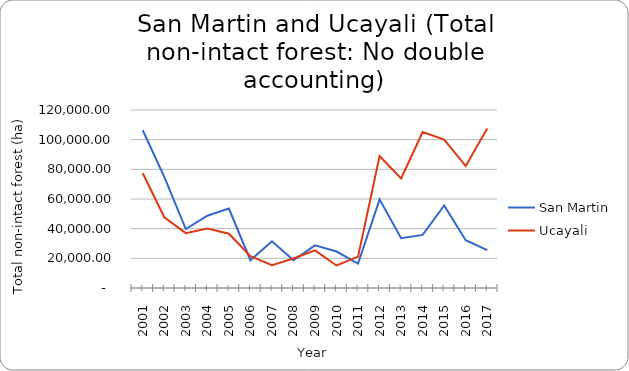
| Category | San Martin | Ucayali |
|---|---|---|
| 2001.0 | 106359.85 | 77381.727 |
| 2002.0 | 74918.95 | 47664.899 |
| 2003.0 | 39704.24 | 36963.338 |
| 2004.0 | 48710.93 | 40105.262 |
| 2005.0 | 53558.28 | 36562.467 |
| 2006.0 | 18703.97 | 21429.377 |
| 2007.0 | 31526.79 | 15411.055 |
| 2008.0 | 18741.89 | 19878.78 |
| 2009.0 | 28731.16 | 25379.185 |
| 2010.0 | 24574.64 | 15181.547 |
| 2011.0 | 16447.08 | 21142.207 |
| 2012.0 | 59764.05 | 89000.681 |
| 2013.0 | 33522.31 | 73873.13 |
| 2014.0 | 35799.95 | 105124.14 |
| 2015.0 | 55675.11 | 99999.92 |
| 2016.0 | 32252.48 | 82196.18 |
| 2017.0 | 25515.86 | 107518.72 |